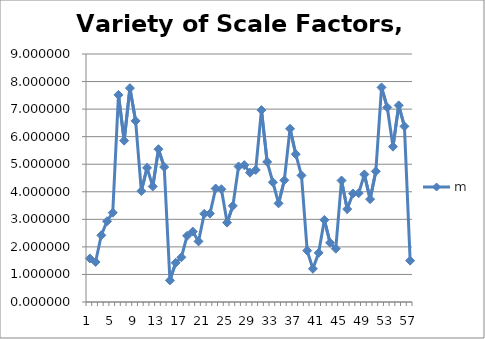
| Category | m |
|---|---|
| 0 | 1.58 |
| 1 | 1.453 |
| 2 | 2.421 |
| 3 | 2.93 |
| 4 | 3.242 |
| 5 | 7.516 |
| 6 | 5.856 |
| 7 | 7.762 |
| 8 | 6.572 |
| 9 | 4.027 |
| 10 | 4.869 |
| 11 | 4.192 |
| 12 | 5.544 |
| 13 | 4.898 |
| 14 | 0.785 |
| 15 | 1.423 |
| 16 | 1.622 |
| 17 | 2.402 |
| 18 | 2.555 |
| 19 | 2.199 |
| 20 | 3.201 |
| 21 | 3.208 |
| 22 | 4.118 |
| 23 | 4.093 |
| 24 | 2.882 |
| 25 | 3.488 |
| 26 | 4.919 |
| 27 | 4.969 |
| 28 | 4.693 |
| 29 | 4.791 |
| 30 | 6.965 |
| 31 | 5.085 |
| 32 | 4.346 |
| 33 | 3.58 |
| 34 | 4.417 |
| 35 | 6.287 |
| 36 | 5.363 |
| 37 | 4.593 |
| 38 | 1.865 |
| 39 | 1.205 |
| 40 | 1.784 |
| 41 | 2.979 |
| 42 | 2.148 |
| 43 | 1.935 |
| 44 | 4.409 |
| 45 | 3.374 |
| 46 | 3.936 |
| 47 | 3.948 |
| 48 | 4.63 |
| 49 | 3.732 |
| 50 | 4.743 |
| 51 | 7.787 |
| 52 | 7.061 |
| 53 | 5.637 |
| 54 | 7.135 |
| 55 | 6.374 |
| 56 | 1.501 |